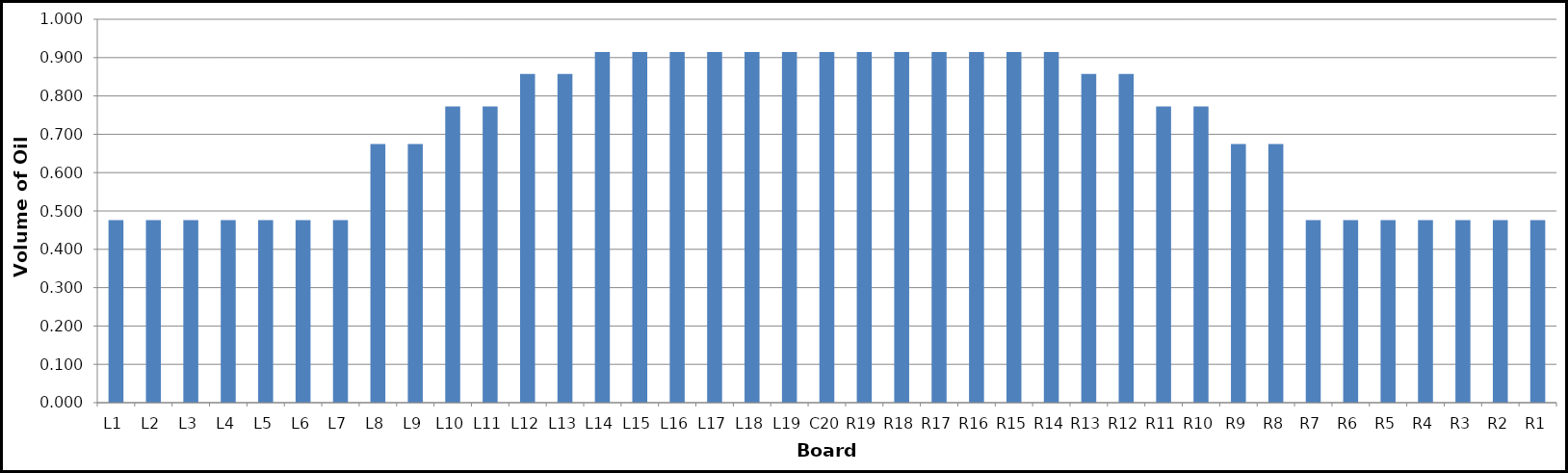
| Category | Series 0 |
|---|---|
| L1 | 0.476 |
| L2 | 0.476 |
| L3 | 0.476 |
| L4 | 0.476 |
| L5 | 0.476 |
| L6 | 0.476 |
| L7 | 0.476 |
| L8 | 0.674 |
| L9 | 0.674 |
| L10 | 0.773 |
| L11 | 0.773 |
| L12 | 0.858 |
| L13 | 0.858 |
| L14 | 0.915 |
| L15 | 0.915 |
| L16 | 0.915 |
| L17 | 0.915 |
| L18 | 0.915 |
| L19 | 0.915 |
| C20 | 0.915 |
| R19 | 0.915 |
| R18 | 0.915 |
| R17 | 0.915 |
| R16 | 0.915 |
| R15 | 0.915 |
| R14 | 0.915 |
| R13 | 0.858 |
| R12 | 0.858 |
| R11 | 0.773 |
| R10 | 0.773 |
| R9 | 0.674 |
| R8 | 0.674 |
| R7 | 0.476 |
| R6 | 0.476 |
| R5 | 0.476 |
| R4 | 0.476 |
| R3 | 0.476 |
| R2 | 0.476 |
| R1 | 0.476 |